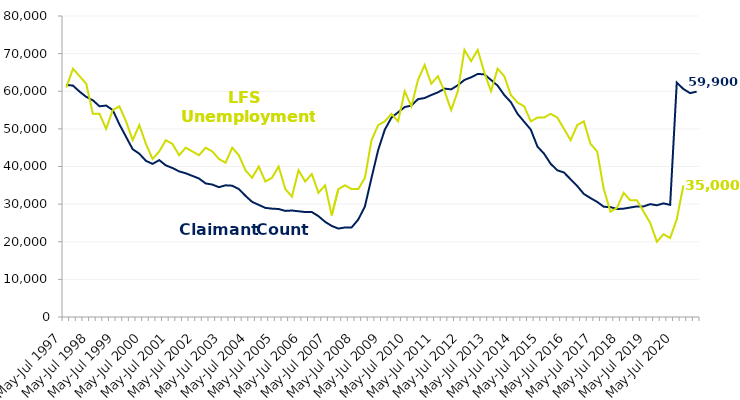
| Category | Claimant Count | LFS Unemployment |
|---|---|---|
| May-Jul 1997 | 61700 | 61000 |
| Aug-Oct 1997 | 61500 | 66000 |
| Nov-Jan 1998 | 59900 | 64000 |
| Feb-Apr 1998 | 58500 | 62000 |
| May-Jul 1998 | 57600 | 54000 |
| Aug-Oct 1998 | 56000 | 54000 |
| Nov-Jan 1999 | 56200 | 50000 |
| Feb-Apr 1999 | 55000 | 55000 |
| May-Jul 1999 | 51200 | 56000 |
| Aug-Oct 1999 | 47900 | 52000 |
| Nov-Jan 2000 | 44600 | 47000 |
| Feb-Apr 2000 | 43400 | 51000 |
| May-Jul 2000 | 41500 | 46000 |
| Aug-Oct 2000 | 40700 | 42000 |
| Nov-Jan 2001 | 41700 | 44000 |
| Feb-Apr 2001 | 40300 | 47000 |
| May-Jul 2001 | 39600 | 46000 |
| Aug-Oct 2001 | 38700 | 43000 |
| Nov-Jan 2002 | 38200 | 45000 |
| Feb-Apr 2002 | 37500 | 44000 |
| May-Jul 2002 | 36800 | 43000 |
| Aug-Oct 2002 | 35500 | 45000 |
| Nov-Jan 2003 | 35200 | 44000 |
| Feb-Apr 2003 | 34500 | 42000 |
| May-Jul 2003 | 35000 | 41000 |
| Aug-Oct 2003 | 34900 | 45000 |
| Nov-Jan 2004 | 34000 | 43000 |
| Feb-Apr 2004 | 32200 | 39000 |
| May-Jul 2004 | 30600 | 37000 |
| Aug-Oct 2004 | 29800 | 40000 |
| Nov-Jan 2005 | 29000 | 36000 |
| Feb-Apr 2005 | 28800 | 37000 |
| May-Jul 2005 | 28700 | 40000 |
| Aug-Oct 2005 | 28200 | 34000 |
| Nov-Jan 2006 | 28300 | 32000 |
| Feb-Apr 2006 | 28100 | 39000 |
| May-Jul 2006 | 27900 | 36000 |
| Aug-Oct 2006 | 27900 | 38000 |
| Nov-Jan 2007 | 26800 | 33000 |
| Feb-Apr 2007 | 25300 | 35000 |
| May-Jul 2007 | 24200 | 27000 |
| Aug-Oct 2007 | 23500 | 34000 |
| Nov-Jan 2008 | 23800 | 35000 |
| Feb-Apr 2008 | 23800 | 34000 |
| May-Jul 2008 | 25900 | 34000 |
| Aug-Oct 2008 | 29400 | 37000 |
| Nov-Jan 2009 | 37000 | 47000 |
| Feb-Apr 2009 | 44400 | 51000 |
| May-Jul 2009 | 49800 | 52000 |
| Aug-Oct 2009 | 53000 | 54000 |
| Nov-Jan 2010 | 54400 | 52000 |
| Feb-Apr 2010 | 55800 | 60000 |
| May-Jul 2010 | 56200 | 56000 |
| Aug-Oct 2010 | 57900 | 63000 |
| Nov-Jan 2011 | 58200 | 67000 |
| Feb-Apr 2011 | 59000 | 62000 |
| May-Jul 2011 | 59700 | 64000 |
| Aug-Oct 2011 | 60700 | 60000 |
| Nov-Jan 2012 | 60500 | 55000 |
| Feb-Apr 2012 | 61600 | 60000 |
| May-Jul 2012 | 63000 | 71000 |
| Aug-Oct 2012 | 63700 | 68000 |
| Nov-Jan 2013 | 64600 | 71000 |
| Feb-Apr 2013 | 64500 | 65000 |
| May-Jul 2013 | 63000 | 60000 |
| Aug-Oct 2013 | 61500 | 66000 |
| Nov-Jan 2014 | 59000 | 64000 |
| Feb-Apr 2014 | 57100 | 59000 |
| May-Jul 2014 | 54000 | 57000 |
| Aug-Oct 2014 | 51900 | 56000 |
| Nov-Jan 2015 | 49800 | 52000 |
| Feb-Apr 2015 | 45300 | 53000 |
| May-Jul 2015 | 43400 | 53000 |
| Aug-Oct 2015 | 40700 | 54000 |
| Nov-Jan 2016 | 39000 | 53000 |
| Feb-Apr 2016 | 38400 | 50000 |
| May-Jul 2016 | 36600 | 47000 |
| Aug-Oct 2016 | 34800 | 51000 |
| Nov-Jan 2017 | 32700 | 52000 |
| Feb-Apr 2017 | 31600 | 46000 |
| May-Jul 2017 | 30600 | 44000 |
| Aug-Oct 2017 | 29300 | 34000 |
| Nov-Jan 2018 | 29200 | 28000 |
| Feb-Apr 2018 | 28700 | 29000 |
| May-Jul 2018 | 28800 | 33000 |
| Aug-Oct 2018 | 29100 | 31000 |
| Nov-Jan 2019 | 29400 | 31000 |
| Feb-Apr 2019 | 29400 | 28000 |
| May-Jul 2019 | 30000 | 25000 |
| Aug-Oct 2019 | 29700 | 20000 |
| Nov-Jan 2020 | 30200 | 22000 |
| Feb-Apr 2020 | 29800 | 21000 |
| May-Jul 2020 | 62300 | 26000 |
| Aug-Oct 2020 | 60600 | 35000 |